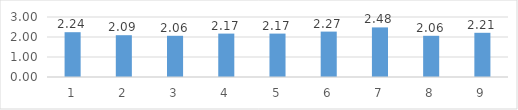
| Category | Series 0 |
|---|---|
| 0 | 2.24 |
| 1 | 2.09 |
| 2 | 2.06 |
| 3 | 2.17 |
| 4 | 2.17 |
| 5 | 2.27 |
| 6 | 2.48 |
| 7 | 2.06 |
| 8 | 2.21 |